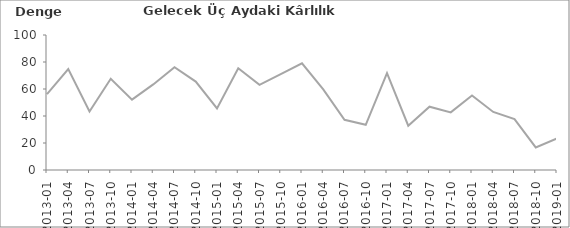
| Category | Gelecek Üç Aydaki Karlılık Beklentisi |
|---|---|
| 2013-01 | 56.2 |
| 2013-04 | 74.8 |
| 2013-07 | 43.3 |
| 2013-10 | 67.6 |
| 2014-01 | 52.1 |
| 2014-04 | 63.4 |
| 2014-07 | 76.1 |
| 2014-10 | 65.5 |
| 2015-01 | 45.6 |
| 2015-04 | 75.4 |
| 2015-07 | 63.1 |
| 2015-10 | 71 |
| 2016-01 | 79 |
| 2016-04 | 59.7 |
| 2016-07 | 37.2 |
| 2016-10 | 33.5 |
| 2017-01 | 71.7 |
| 2017-04 | 32.8 |
| 2017-07 | 46.9 |
| 2017-10 | 42.7 |
| 2018-01 | 55.2 |
| 2018-04 | 43 |
| 2018-07 | 37.7 |
| 2018-10 | 16.7 |
| 2019-01 | 23.4 |